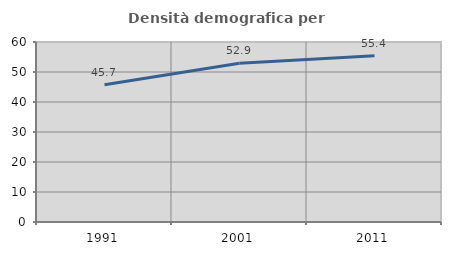
| Category | Densità demografica |
|---|---|
| 1991.0 | 45.739 |
| 2001.0 | 52.924 |
| 2011.0 | 55.377 |